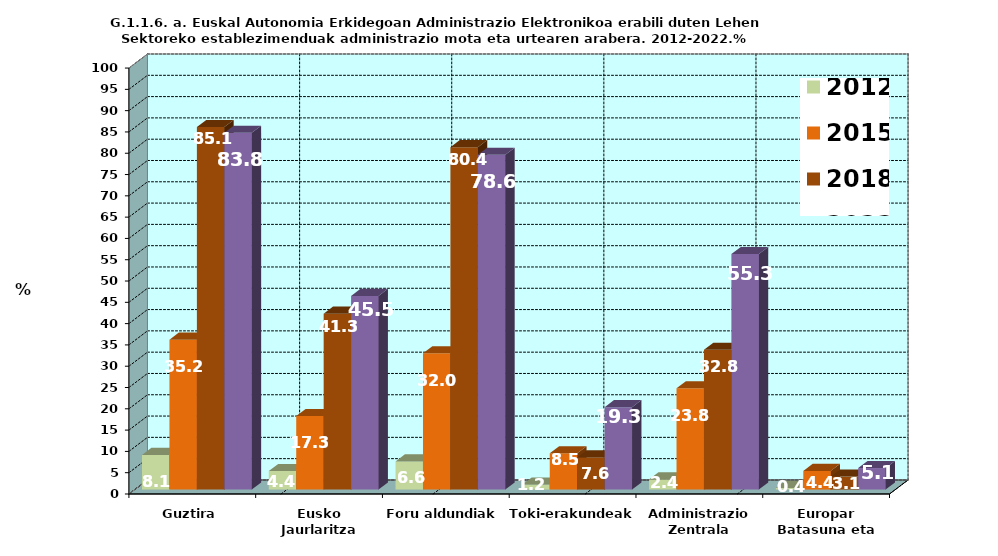
| Category | 2012 | 2015 | 2018 | 2022 |
|---|---|---|---|---|
| Guztira | 8.118 | 35.191 | 85.112 | 83.771 |
| Eusko Jaurlaritza | 4.354 | 17.258 | 41.292 | 45.46 |
| Foru aldundiak | 6.605 | 31.999 | 80.374 | 78.574 |
| Toki-erakundeak | 1.185 | 8.528 | 7.554 | 19.329 |
| Administrazio Zentrala | 2.382 | 23.776 | 32.794 | 55.288 |
| Europar Batasuna eta beste batzuk | 0.375 | 4.374 | 3.052 | 5.051 |